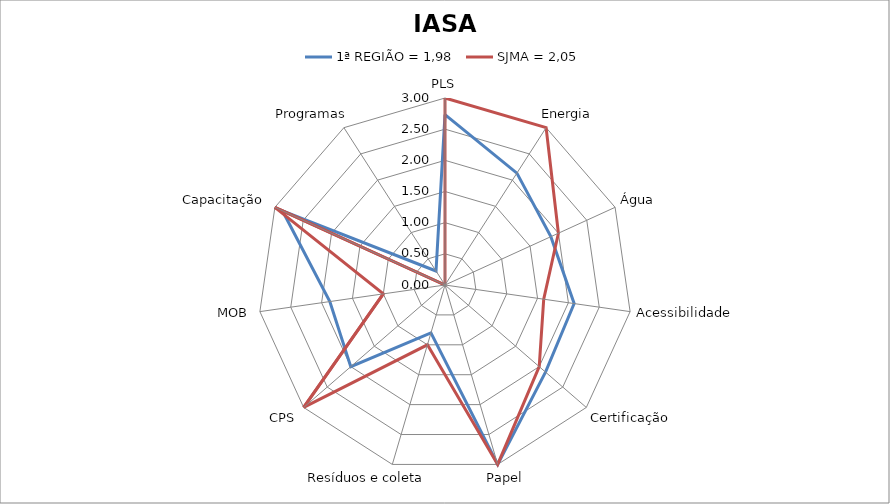
| Category | 1ª REGIÃO = 1,98 | SJMA = 2,05 |
|---|---|---|
| PLS | 2.733 | 3 |
| Energia | 2.133 | 3 |
| Água | 1.867 | 2 |
| Acessibilidade | 2.093 | 1.6 |
| Certificação | 2.133 | 2 |
| Papel | 3 | 3 |
| Resíduos e coleta | 0.8 | 1 |
| CPS | 2 | 3 |
| MOB | 1.867 | 1 |
| Capacitação | 2.867 | 3 |
| Programas | 0.267 | 0 |